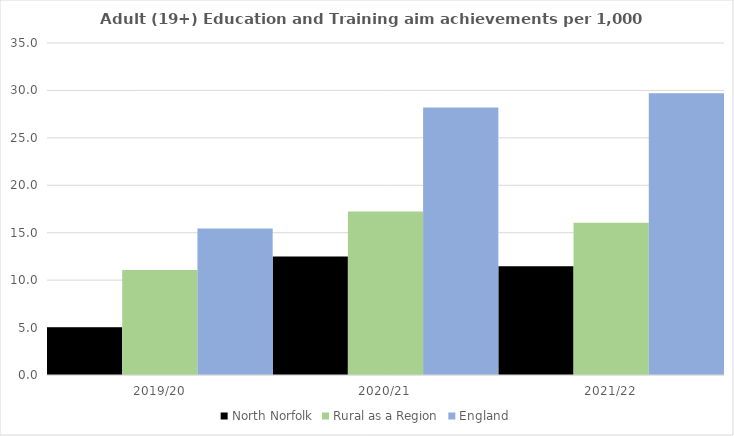
| Category | North Norfolk | Rural as a Region | England |
|---|---|---|---|
| 2019/20 | 5.023 | 11.081 | 15.446 |
| 2020/21 | 12.485 | 17.224 | 28.211 |
| 2021/22 | 11.462 | 16.063 | 29.711 |